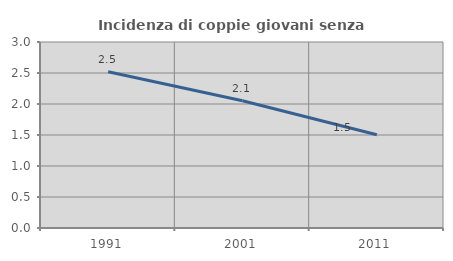
| Category | Incidenza di coppie giovani senza figli |
|---|---|
| 1991.0 | 2.521 |
| 2001.0 | 2.051 |
| 2011.0 | 1.505 |